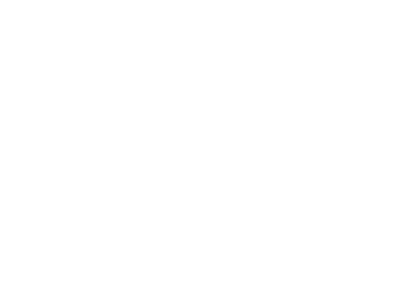
| Category | Total |
|---|---|
| A iniciar | 215 |
| Atrasado | 28 |
| Cancelado | 3 |
| Concluído | 15 |
| Em dia | 203 |
| Suspenso | 4 |